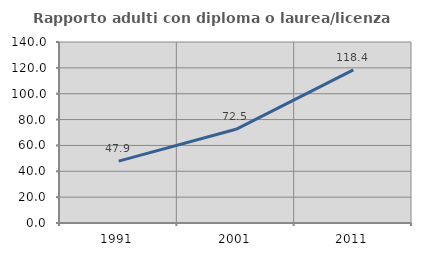
| Category | Rapporto adulti con diploma o laurea/licenza media  |
|---|---|
| 1991.0 | 47.86 |
| 2001.0 | 72.462 |
| 2011.0 | 118.421 |